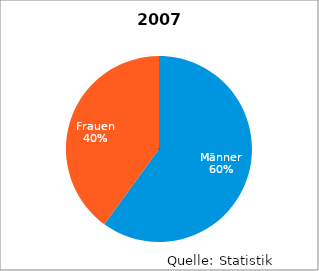
| Category | 2007 |
|---|---|
| Männer | 9 |
| Frauen | 6 |